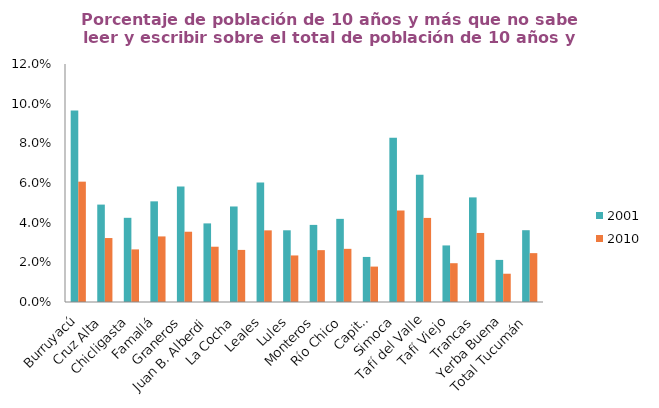
| Category | 2001 | 2010 |
|---|---|---|
| Burruyacú | 0.097 | 0.061 |
| Cruz Alta | 0.049 | 0.032 |
| Chicligasta | 0.042 | 0.027 |
| Famallá | 0.051 | 0.033 |
| Graneros | 0.058 | 0.035 |
| Juan B. Alberdi | 0.04 | 0.028 |
| La Cocha | 0.048 | 0.026 |
| Leales | 0.06 | 0.036 |
| Lules | 0.036 | 0.023 |
| Monteros | 0.039 | 0.026 |
| Río Chico | 0.042 | 0.027 |
| Capital | 0.023 | 0.018 |
| Simoca | 0.083 | 0.046 |
| Tafí del Valle | 0.064 | 0.042 |
| Tafí Viejo | 0.029 | 0.02 |
| Trancas | 0.053 | 0.035 |
| Yerba Buena | 0.021 | 0.014 |
| Total Tucumán | 0.036 | 0.025 |